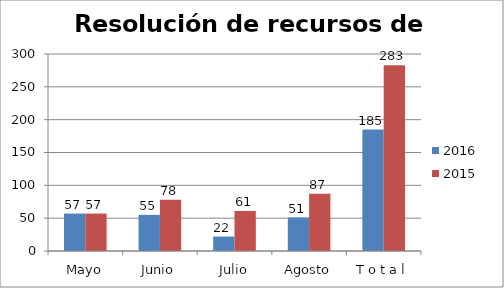
| Category | 2016 | 2015 |
|---|---|---|
| Mayo | 57 | 57 |
| Junio | 55 | 78 |
| Julio | 22 | 61 |
| Agosto | 51 | 87 |
| T o t a l | 185 | 283 |